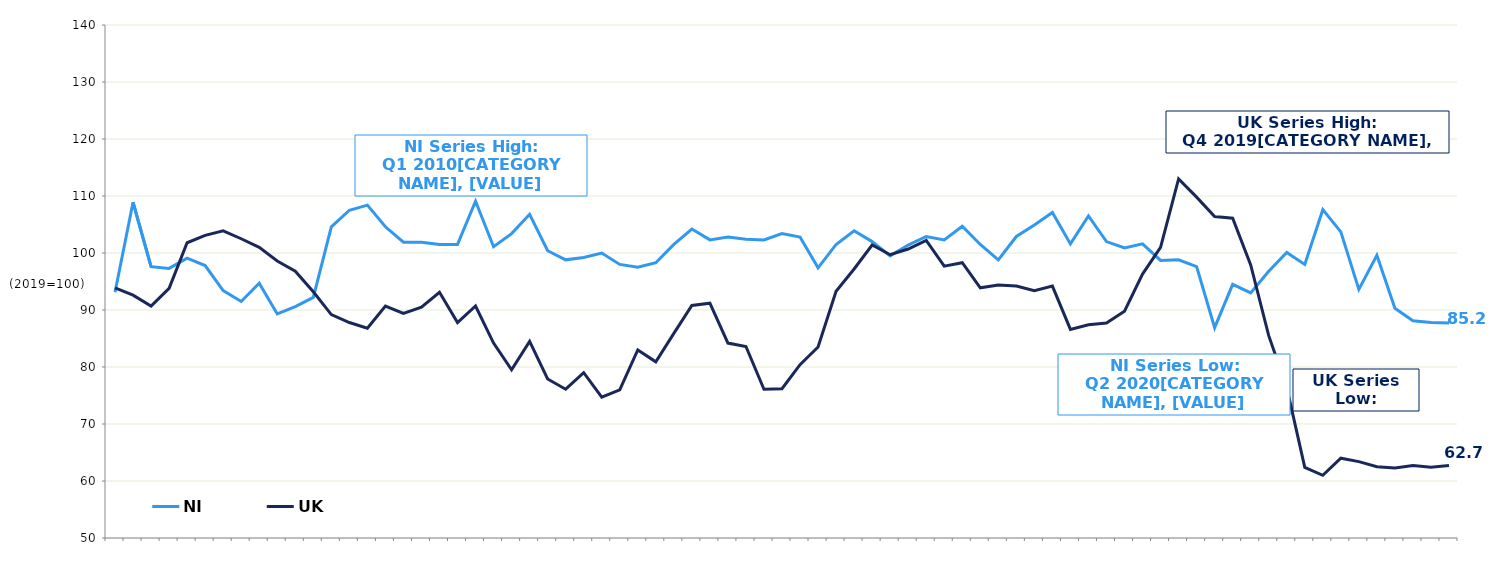
| Category | NI | UK  |
|---|---|---|
|  | 93.1 | 93.9 |
|  | 108.9 | 92.6 |
| Q3 2005 | 97.6 | 90.7 |
|  | 97.3 | 93.8 |
|  | 99.1 | 101.8 |
|  | 97.8 | 103.1 |
| Q3 2006 | 93.4 | 103.9 |
|  | 91.5 | 102.5 |
|  | 94.7 | 101 |
|  | 89.3 | 98.6 |
| Q3 2007 | 90.6 | 96.8 |
|  | 92.2 | 93.2 |
|  | 104.6 | 89.2 |
|  | 107.5 | 87.8 |
| Q3 2008 | 108.4 | 86.8 |
|  | 104.6 | 90.7 |
|  | 101.9 | 89.4 |
|  | 101.9 | 90.5 |
| Q3 2009 | 101.5 | 93.1 |
|  | 101.5 | 87.8 |
|  | 109.1 | 90.7 |
|  | 101.1 | 84.2 |
| Q3 2010 | 103.4 | 79.5 |
|  | 106.8 | 84.5 |
|  | 100.4 | 77.9 |
|  | 98.8 | 76.1 |
| Q3 2011 | 99.2 | 79 |
|  | 100 | 74.7 |
|  | 98 | 76 |
|  | 97.5 | 83 |
| Q3 2012 | 98.3 | 80.9 |
|  | 101.5 | 85.9 |
|  | 104.2 | 90.8 |
|  | 102.3 | 91.2 |
| Q3 2013 | 102.8 | 84.2 |
|  | 102.4 | 83.6 |
|  | 102.3 | 76.1 |
|  | 103.4 | 76.2 |
| Q3 2014 | 102.8 | 80.4 |
|  | 97.4 | 83.5 |
|  | 101.5 | 93.3 |
|  | 103.9 | 97.2 |
| Q3 2015 | 102 | 101.4 |
|  | 99.5 | 99.7 |
|  | 101.4 | 100.7 |
|  | 102.9 | 102.2 |
| Q3 2016 | 102.3 | 97.7 |
|  | 104.7 | 98.3 |
|  | 101.5 | 93.9 |
|  | 98.8 | 94.4 |
| Q3 2017 | 102.9 | 94.2 |
|  | 104.9 | 93.4 |
|  | 107.1 | 94.2 |
|  | 101.6 | 86.6 |
| Q3 2018 | 106.5 | 87.4 |
|  | 102 | 87.7 |
|  | 100.9 | 89.8 |
|  | 101.6 | 96.3 |
| Q3 2019 | 98.7 | 101 |
|  | 98.8 | 113 |
|  | 97.6 | 109.8 |
|  | 86.9 | 106.4 |
| Q3 2020 | 94.5 | 106.1 |
|  | 93 | 97.9 |
|  | 96.8 | 85.5 |
|  | 100.1 | 76.4 |
| Q3 2021 | 98 | 62.4 |
|  | 107.6 | 61 |
|  | 103.7 | 64 |
|  | 93.6 | 63.4 |
| Q3 2022 | 99.6 | 62.5 |
|  | 90.3 | 62.3 |
|  | 88.1 | 62.7 |
|  | 87.8 | 62.4 |
| Q3 2023 | 87.7 | 62.7 |